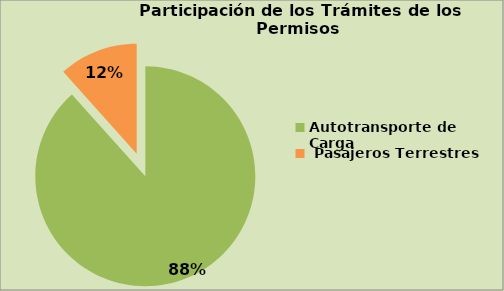
| Category | Series 0 |
|---|---|
| Autotransporte de Carga  | 88.37 |
|  Pasajeros Terrestres | 11.63 |